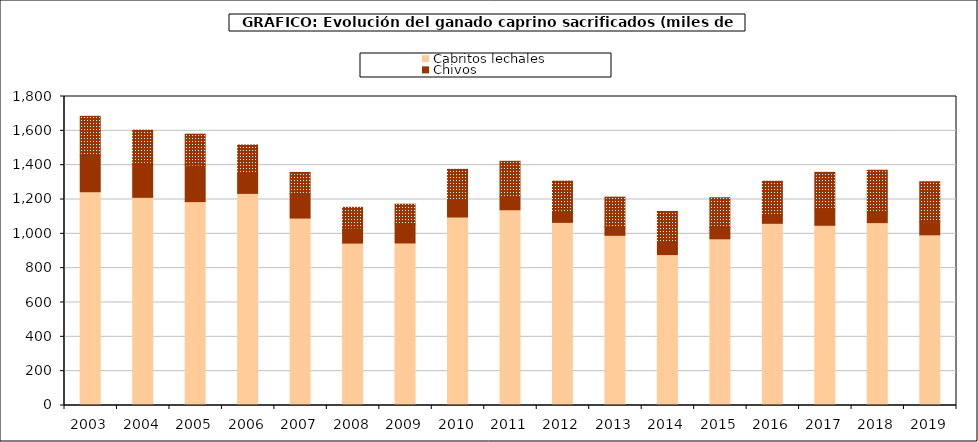
| Category | Cabritos | Chivos | Mayor |
|---|---|---|---|
| 2003.0 | 1245.325 | 212.255 | 227.066 |
| 2004.0 | 1212.757 | 193.057 | 197.929 |
| 2005.0 | 1187.568 | 213.586 | 179.395 |
| 2006.0 | 1235.634 | 116.214 | 165.659 |
| 2007.0 | 1091.939 | 142.795 | 123.018 |
| 2008.0 | 946.005 | 88.612 | 119.891 |
| 2009.0 | 946.871 | 111.232 | 114.664 |
| 2010.0 | 1098.192 | 101.913 | 175.759 |
| 2011.0 | 1140.362 | 79.178 | 203.056 |
| 2012.0 | 1066.793 | 67.733 | 172.561 |
| 2013.0 | 991.445 | 48.941 | 173.365 |
| 2014.0 | 878.99 | 82.198 | 169.027 |
| 2015.0 | 971.043 | 66.091 | 173.135 |
| 2016.0 | 1061.299 | 51.43 | 193.715 |
| 2017.0 | 1049.788 | 91.752 | 216.862 |
| 2018.0 | 1065.202 | 67.41 | 238.414 |
| 2019.0 | 994.215 | 77.091 | 232.094 |